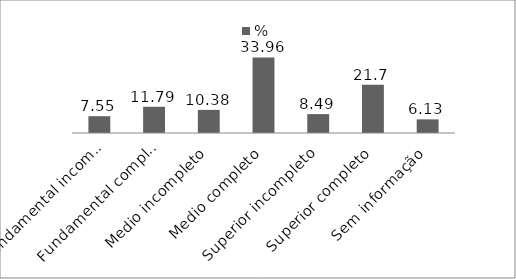
| Category | % |
|---|---|
| Fundamental incompleto | 7.55 |
| Fundamental completo | 11.79 |
| Medio incompleto | 10.38 |
| Medio completo | 33.96 |
| Superior incompleto | 8.49 |
| Superior completo | 21.7 |
| Sem informação | 6.13 |